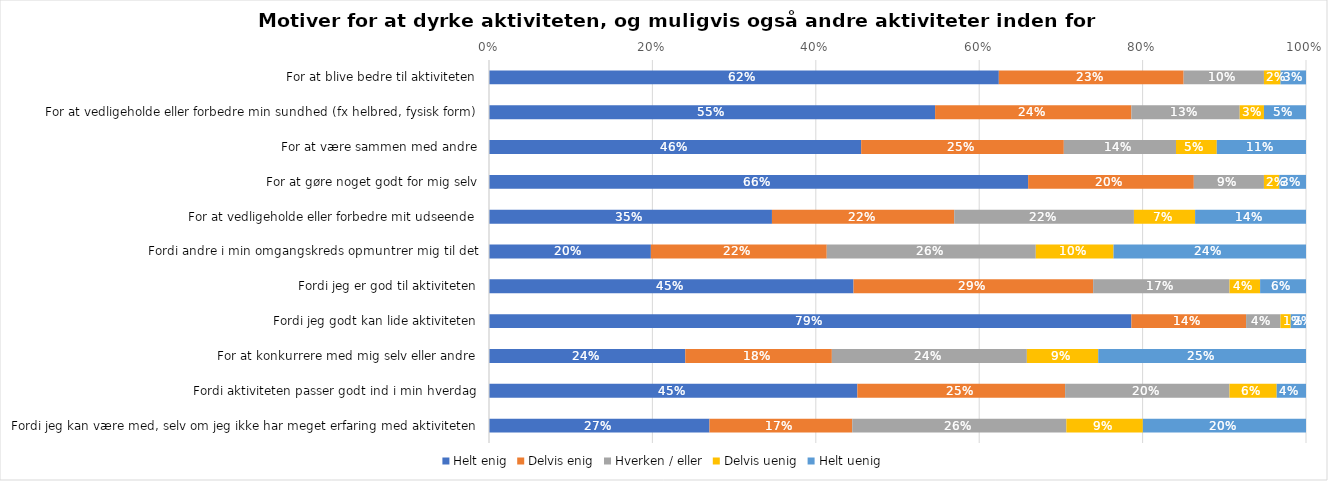
| Category | Helt enig | Delvis enig | Hverken / eller | Delvis uenig | Helt uenig |
|---|---|---|---|---|---|
| For at blive bedre til aktiviteten | 0.624 | 0.226 | 0.098 | 0.02 | 0.031 |
| For at vedligeholde eller forbedre min sundhed (fx helbred, fysisk form) | 0.546 | 0.24 | 0.133 | 0.03 | 0.051 |
| For at være sammen med andre | 0.456 | 0.248 | 0.137 | 0.05 | 0.109 |
| For at gøre noget godt for mig selv | 0.66 | 0.203 | 0.086 | 0.019 | 0.033 |
| For at vedligeholde eller forbedre mit udseende | 0.346 | 0.223 | 0.22 | 0.075 | 0.136 |
| Fordi andre i min omgangskreds opmuntrer mig til det | 0.198 | 0.215 | 0.256 | 0.095 | 0.236 |
| Fordi jeg er god til aktiviteten | 0.446 | 0.293 | 0.167 | 0.037 | 0.056 |
| Fordi jeg godt kan lide aktiviteten | 0.786 | 0.14 | 0.042 | 0.012 | 0.019 |
| For at konkurrere med mig selv eller andre | 0.24 | 0.179 | 0.239 | 0.087 | 0.254 |
| Fordi aktiviteten passer godt ind i min hverdag | 0.451 | 0.254 | 0.201 | 0.058 | 0.036 |
| Fordi jeg kan være med, selv om jeg ikke har meget erfaring med aktiviteten | 0.27 | 0.175 | 0.262 | 0.094 | 0.2 |